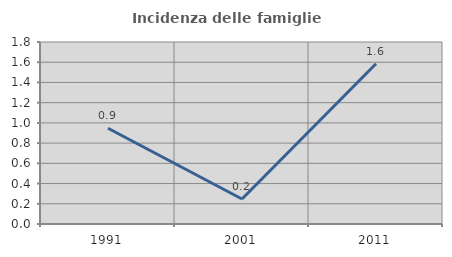
| Category | Incidenza delle famiglie numerose |
|---|---|
| 1991.0 | 0.947 |
| 2001.0 | 0.247 |
| 2011.0 | 1.586 |